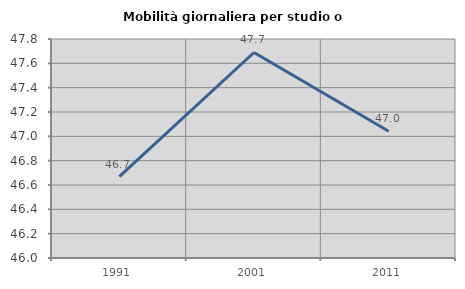
| Category | Mobilità giornaliera per studio o lavoro |
|---|---|
| 1991.0 | 46.669 |
| 2001.0 | 47.689 |
| 2011.0 | 47.041 |